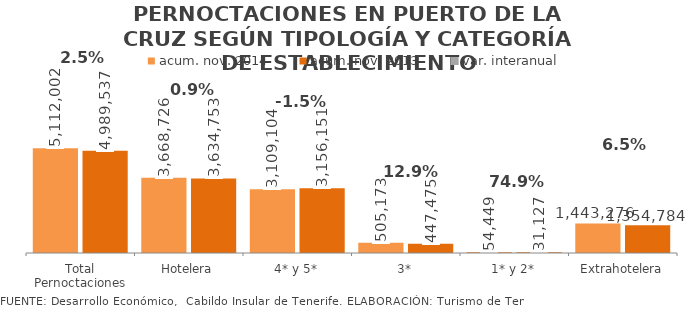
| Category | acum. nov. 2014 | acum. nov. 2013 |
|---|---|---|
| Total Pernoctaciones | 5112002 | 4989537 |
| Hotelera | 3668726 | 3634753 |
| 4* y 5* | 3109104 | 3156151 |
| 3* | 505173 | 447475 |
| 1* y 2* | 54449 | 31127 |
| Extrahotelera | 1443276 | 1354784 |